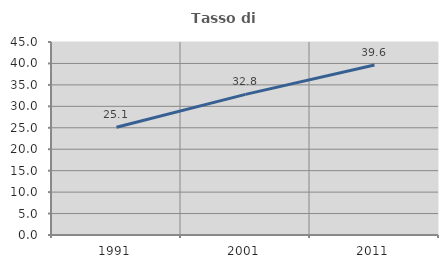
| Category | Tasso di occupazione   |
|---|---|
| 1991.0 | 25.141 |
| 2001.0 | 32.787 |
| 2011.0 | 39.618 |